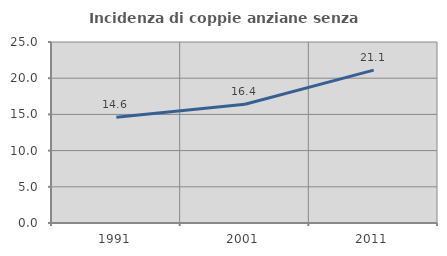
| Category | Incidenza di coppie anziane senza figli  |
|---|---|
| 1991.0 | 14.592 |
| 2001.0 | 16.406 |
| 2011.0 | 21.116 |